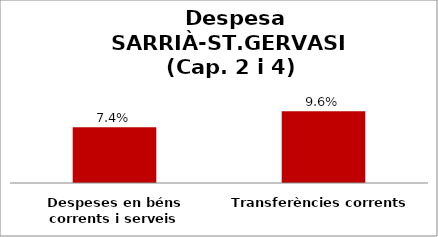
| Category | Series 0 |
|---|---|
| Despeses en béns corrents i serveis | 0.074 |
| Transferències corrents | 0.096 |